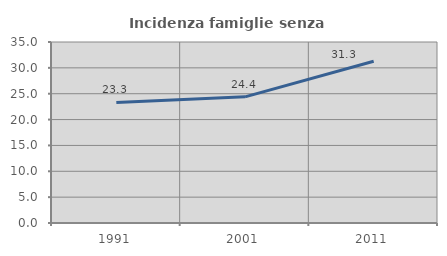
| Category | Incidenza famiglie senza nuclei |
|---|---|
| 1991.0 | 23.307 |
| 2001.0 | 24.396 |
| 2011.0 | 31.288 |